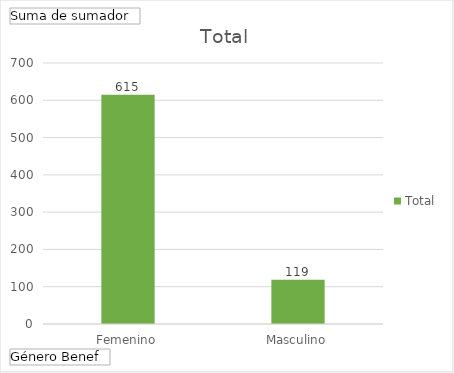
| Category | Total |
|---|---|
| Femenino | 615 |
| Masculino | 119 |